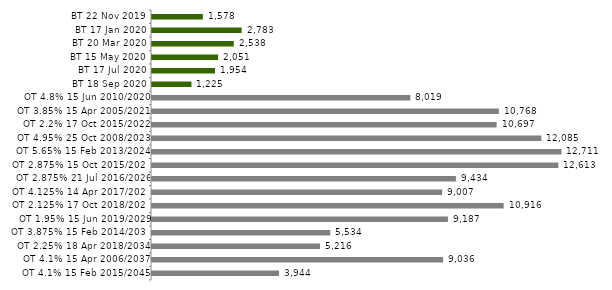
| Category | Series 0 |
|---|---|
| BT 22 Nov 2019 | 1578.275 |
| BT 17 Jan 2020 | 2783.367 |
| BT 20 Mar 2020 | 2537.535 |
| BT 15 May 2020 | 2051.372 |
| BT 17 Jul 2020 | 1954.16 |
| BT 18 Sep 2020 | 1225.188 |
| OT 4.8% 15 Jun 2010/2020 | 8018.658 |
| OT 3.85% 15 Apr 2005/2021 | 10767.958 |
| OT 2.2% 17 Oct 2015/2022 | 10697.462 |
| OT 4.95% 25 Oct 2008/2023 | 12084.734 |
| OT 5.65% 15 Feb 2013/2024 | 12711.355 |
| OT 2.875% 15 Oct 2015/2025 | 12613.263 |
| OT 2.875% 21 Jul 2016/2026 | 9433.982 |
| OT 4.125% 14 Apr 2017/2027 | 9006.841 |
| OT 2.125% 17 Oct 2018/2028 | 10916.387 |
| OT 1.95% 15 Jun 2019/2029 | 9186.52 |
| OT 3.875% 15 Feb 2014/2030 | 5533.902 |
| OT 2.25% 18 Apr 2018/2034 | 5215.845 |
| OT 4.1% 15 Apr 2006/2037 | 9036.174 |
| OT 4.1% 15 Feb 2015/2045 | 3944.316 |